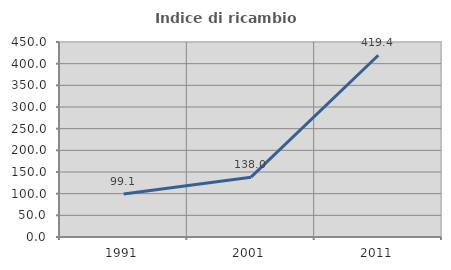
| Category | Indice di ricambio occupazionale  |
|---|---|
| 1991.0 | 99.057 |
| 2001.0 | 138.028 |
| 2011.0 | 419.444 |